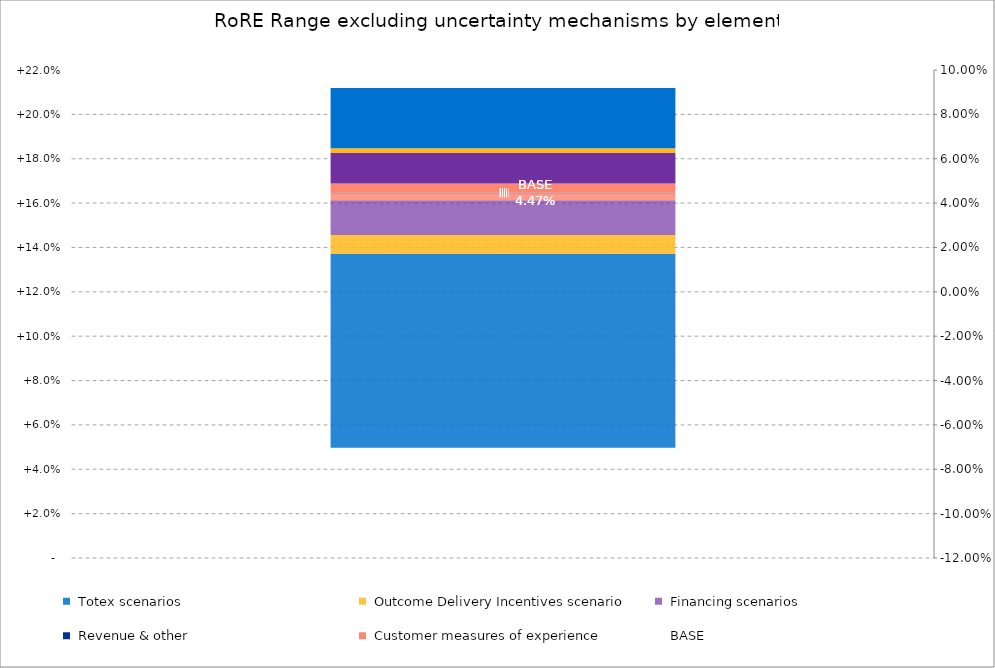
| Category |  Minimum  |  Totex scenarios  |  Outcome Delivery Incentives scenario  |  Financing scenarios  |  Customer measures of experience  |  Revenue & other  | Series 21 | Series 22 | Series 23 | Series 24 | Series 25 | Series 26 | Series 27 | Series 28 |
|---|---|---|---|---|---|---|---|---|---|---|---|---|---|---|
| RoRE Base case | 0.05 | 0.027 | 0.002 | 0.014 | 0.004 | 0 |  |  |  |  |  |  |  |  |